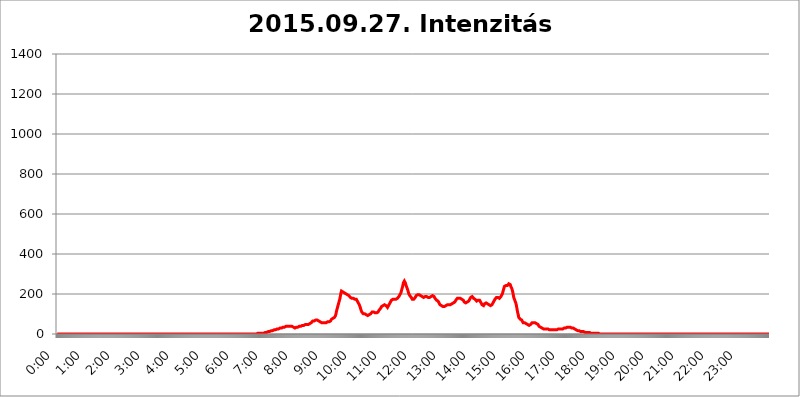
| Category | 2015.09.27. Intenzitás [W/m^2] |
|---|---|
| 0.0 | 0 |
| 0.0006944444444444445 | 0 |
| 0.001388888888888889 | 0 |
| 0.0020833333333333333 | 0 |
| 0.002777777777777778 | 0 |
| 0.003472222222222222 | 0 |
| 0.004166666666666667 | 0 |
| 0.004861111111111111 | 0 |
| 0.005555555555555556 | 0 |
| 0.0062499999999999995 | 0 |
| 0.006944444444444444 | 0 |
| 0.007638888888888889 | 0 |
| 0.008333333333333333 | 0 |
| 0.009027777777777779 | 0 |
| 0.009722222222222222 | 0 |
| 0.010416666666666666 | 0 |
| 0.011111111111111112 | 0 |
| 0.011805555555555555 | 0 |
| 0.012499999999999999 | 0 |
| 0.013194444444444444 | 0 |
| 0.013888888888888888 | 0 |
| 0.014583333333333332 | 0 |
| 0.015277777777777777 | 0 |
| 0.015972222222222224 | 0 |
| 0.016666666666666666 | 0 |
| 0.017361111111111112 | 0 |
| 0.018055555555555557 | 0 |
| 0.01875 | 0 |
| 0.019444444444444445 | 0 |
| 0.02013888888888889 | 0 |
| 0.020833333333333332 | 0 |
| 0.02152777777777778 | 0 |
| 0.022222222222222223 | 0 |
| 0.02291666666666667 | 0 |
| 0.02361111111111111 | 0 |
| 0.024305555555555556 | 0 |
| 0.024999999999999998 | 0 |
| 0.025694444444444447 | 0 |
| 0.02638888888888889 | 0 |
| 0.027083333333333334 | 0 |
| 0.027777777777777776 | 0 |
| 0.02847222222222222 | 0 |
| 0.029166666666666664 | 0 |
| 0.029861111111111113 | 0 |
| 0.030555555555555555 | 0 |
| 0.03125 | 0 |
| 0.03194444444444445 | 0 |
| 0.03263888888888889 | 0 |
| 0.03333333333333333 | 0 |
| 0.034027777777777775 | 0 |
| 0.034722222222222224 | 0 |
| 0.035416666666666666 | 0 |
| 0.036111111111111115 | 0 |
| 0.03680555555555556 | 0 |
| 0.0375 | 0 |
| 0.03819444444444444 | 0 |
| 0.03888888888888889 | 0 |
| 0.03958333333333333 | 0 |
| 0.04027777777777778 | 0 |
| 0.04097222222222222 | 0 |
| 0.041666666666666664 | 0 |
| 0.042361111111111106 | 0 |
| 0.04305555555555556 | 0 |
| 0.043750000000000004 | 0 |
| 0.044444444444444446 | 0 |
| 0.04513888888888889 | 0 |
| 0.04583333333333334 | 0 |
| 0.04652777777777778 | 0 |
| 0.04722222222222222 | 0 |
| 0.04791666666666666 | 0 |
| 0.04861111111111111 | 0 |
| 0.049305555555555554 | 0 |
| 0.049999999999999996 | 0 |
| 0.05069444444444445 | 0 |
| 0.051388888888888894 | 0 |
| 0.052083333333333336 | 0 |
| 0.05277777777777778 | 0 |
| 0.05347222222222222 | 0 |
| 0.05416666666666667 | 0 |
| 0.05486111111111111 | 0 |
| 0.05555555555555555 | 0 |
| 0.05625 | 0 |
| 0.05694444444444444 | 0 |
| 0.057638888888888885 | 0 |
| 0.05833333333333333 | 0 |
| 0.05902777777777778 | 0 |
| 0.059722222222222225 | 0 |
| 0.06041666666666667 | 0 |
| 0.061111111111111116 | 0 |
| 0.06180555555555556 | 0 |
| 0.0625 | 0 |
| 0.06319444444444444 | 0 |
| 0.06388888888888888 | 0 |
| 0.06458333333333334 | 0 |
| 0.06527777777777778 | 0 |
| 0.06597222222222222 | 0 |
| 0.06666666666666667 | 0 |
| 0.06736111111111111 | 0 |
| 0.06805555555555555 | 0 |
| 0.06874999999999999 | 0 |
| 0.06944444444444443 | 0 |
| 0.07013888888888889 | 0 |
| 0.07083333333333333 | 0 |
| 0.07152777777777779 | 0 |
| 0.07222222222222223 | 0 |
| 0.07291666666666667 | 0 |
| 0.07361111111111111 | 0 |
| 0.07430555555555556 | 0 |
| 0.075 | 0 |
| 0.07569444444444444 | 0 |
| 0.0763888888888889 | 0 |
| 0.07708333333333334 | 0 |
| 0.07777777777777778 | 0 |
| 0.07847222222222222 | 0 |
| 0.07916666666666666 | 0 |
| 0.0798611111111111 | 0 |
| 0.08055555555555556 | 0 |
| 0.08125 | 0 |
| 0.08194444444444444 | 0 |
| 0.08263888888888889 | 0 |
| 0.08333333333333333 | 0 |
| 0.08402777777777777 | 0 |
| 0.08472222222222221 | 0 |
| 0.08541666666666665 | 0 |
| 0.08611111111111112 | 0 |
| 0.08680555555555557 | 0 |
| 0.08750000000000001 | 0 |
| 0.08819444444444445 | 0 |
| 0.08888888888888889 | 0 |
| 0.08958333333333333 | 0 |
| 0.09027777777777778 | 0 |
| 0.09097222222222222 | 0 |
| 0.09166666666666667 | 0 |
| 0.09236111111111112 | 0 |
| 0.09305555555555556 | 0 |
| 0.09375 | 0 |
| 0.09444444444444444 | 0 |
| 0.09513888888888888 | 0 |
| 0.09583333333333333 | 0 |
| 0.09652777777777777 | 0 |
| 0.09722222222222222 | 0 |
| 0.09791666666666667 | 0 |
| 0.09861111111111111 | 0 |
| 0.09930555555555555 | 0 |
| 0.09999999999999999 | 0 |
| 0.10069444444444443 | 0 |
| 0.1013888888888889 | 0 |
| 0.10208333333333335 | 0 |
| 0.10277777777777779 | 0 |
| 0.10347222222222223 | 0 |
| 0.10416666666666667 | 0 |
| 0.10486111111111111 | 0 |
| 0.10555555555555556 | 0 |
| 0.10625 | 0 |
| 0.10694444444444444 | 0 |
| 0.1076388888888889 | 0 |
| 0.10833333333333334 | 0 |
| 0.10902777777777778 | 0 |
| 0.10972222222222222 | 0 |
| 0.1111111111111111 | 0 |
| 0.11180555555555556 | 0 |
| 0.11180555555555556 | 0 |
| 0.1125 | 0 |
| 0.11319444444444444 | 0 |
| 0.11388888888888889 | 0 |
| 0.11458333333333333 | 0 |
| 0.11527777777777777 | 0 |
| 0.11597222222222221 | 0 |
| 0.11666666666666665 | 0 |
| 0.1173611111111111 | 0 |
| 0.11805555555555557 | 0 |
| 0.11944444444444445 | 0 |
| 0.12013888888888889 | 0 |
| 0.12083333333333333 | 0 |
| 0.12152777777777778 | 0 |
| 0.12222222222222223 | 0 |
| 0.12291666666666667 | 0 |
| 0.12291666666666667 | 0 |
| 0.12361111111111112 | 0 |
| 0.12430555555555556 | 0 |
| 0.125 | 0 |
| 0.12569444444444444 | 0 |
| 0.12638888888888888 | 0 |
| 0.12708333333333333 | 0 |
| 0.16875 | 0 |
| 0.12847222222222224 | 0 |
| 0.12916666666666668 | 0 |
| 0.12986111111111112 | 0 |
| 0.13055555555555556 | 0 |
| 0.13125 | 0 |
| 0.13194444444444445 | 0 |
| 0.1326388888888889 | 0 |
| 0.13333333333333333 | 0 |
| 0.13402777777777777 | 0 |
| 0.13402777777777777 | 0 |
| 0.13472222222222222 | 0 |
| 0.13541666666666666 | 0 |
| 0.1361111111111111 | 0 |
| 0.13749999999999998 | 0 |
| 0.13819444444444443 | 0 |
| 0.1388888888888889 | 0 |
| 0.13958333333333334 | 0 |
| 0.14027777777777778 | 0 |
| 0.14097222222222222 | 0 |
| 0.14166666666666666 | 0 |
| 0.1423611111111111 | 0 |
| 0.14305555555555557 | 0 |
| 0.14375000000000002 | 0 |
| 0.14444444444444446 | 0 |
| 0.1451388888888889 | 0 |
| 0.1451388888888889 | 0 |
| 0.14652777777777778 | 0 |
| 0.14722222222222223 | 0 |
| 0.14791666666666667 | 0 |
| 0.1486111111111111 | 0 |
| 0.14930555555555555 | 0 |
| 0.15 | 0 |
| 0.15069444444444444 | 0 |
| 0.15138888888888888 | 0 |
| 0.15208333333333332 | 0 |
| 0.15277777777777776 | 0 |
| 0.15347222222222223 | 0 |
| 0.15416666666666667 | 0 |
| 0.15486111111111112 | 0 |
| 0.15555555555555556 | 0 |
| 0.15625 | 0 |
| 0.15694444444444444 | 0 |
| 0.15763888888888888 | 0 |
| 0.15833333333333333 | 0 |
| 0.15902777777777777 | 0 |
| 0.15972222222222224 | 0 |
| 0.16041666666666668 | 0 |
| 0.16111111111111112 | 0 |
| 0.16180555555555556 | 0 |
| 0.1625 | 0 |
| 0.16319444444444445 | 0 |
| 0.1638888888888889 | 0 |
| 0.16458333333333333 | 0 |
| 0.16527777777777777 | 0 |
| 0.16597222222222222 | 0 |
| 0.16666666666666666 | 0 |
| 0.1673611111111111 | 0 |
| 0.16805555555555554 | 0 |
| 0.16874999999999998 | 0 |
| 0.16944444444444443 | 0 |
| 0.17013888888888887 | 0 |
| 0.1708333333333333 | 0 |
| 0.17152777777777775 | 0 |
| 0.17222222222222225 | 0 |
| 0.1729166666666667 | 0 |
| 0.17361111111111113 | 0 |
| 0.17430555555555557 | 0 |
| 0.17500000000000002 | 0 |
| 0.17569444444444446 | 0 |
| 0.1763888888888889 | 0 |
| 0.17708333333333334 | 0 |
| 0.17777777777777778 | 0 |
| 0.17847222222222223 | 0 |
| 0.17916666666666667 | 0 |
| 0.1798611111111111 | 0 |
| 0.18055555555555555 | 0 |
| 0.18125 | 0 |
| 0.18194444444444444 | 0 |
| 0.1826388888888889 | 0 |
| 0.18333333333333335 | 0 |
| 0.1840277777777778 | 0 |
| 0.18472222222222223 | 0 |
| 0.18541666666666667 | 0 |
| 0.18611111111111112 | 0 |
| 0.18680555555555556 | 0 |
| 0.1875 | 0 |
| 0.18819444444444444 | 0 |
| 0.18888888888888888 | 0 |
| 0.18958333333333333 | 0 |
| 0.19027777777777777 | 0 |
| 0.1909722222222222 | 0 |
| 0.19166666666666665 | 0 |
| 0.19236111111111112 | 0 |
| 0.19305555555555554 | 0 |
| 0.19375 | 0 |
| 0.19444444444444445 | 0 |
| 0.1951388888888889 | 0 |
| 0.19583333333333333 | 0 |
| 0.19652777777777777 | 0 |
| 0.19722222222222222 | 0 |
| 0.19791666666666666 | 0 |
| 0.1986111111111111 | 0 |
| 0.19930555555555554 | 0 |
| 0.19999999999999998 | 0 |
| 0.20069444444444443 | 0 |
| 0.20138888888888887 | 0 |
| 0.2020833333333333 | 0 |
| 0.2027777777777778 | 0 |
| 0.2034722222222222 | 0 |
| 0.2041666666666667 | 0 |
| 0.20486111111111113 | 0 |
| 0.20555555555555557 | 0 |
| 0.20625000000000002 | 0 |
| 0.20694444444444446 | 0 |
| 0.2076388888888889 | 0 |
| 0.20833333333333334 | 0 |
| 0.20902777777777778 | 0 |
| 0.20972222222222223 | 0 |
| 0.21041666666666667 | 0 |
| 0.2111111111111111 | 0 |
| 0.21180555555555555 | 0 |
| 0.2125 | 0 |
| 0.21319444444444444 | 0 |
| 0.2138888888888889 | 0 |
| 0.21458333333333335 | 0 |
| 0.2152777777777778 | 0 |
| 0.21597222222222223 | 0 |
| 0.21666666666666667 | 0 |
| 0.21736111111111112 | 0 |
| 0.21805555555555556 | 0 |
| 0.21875 | 0 |
| 0.21944444444444444 | 0 |
| 0.22013888888888888 | 0 |
| 0.22083333333333333 | 0 |
| 0.22152777777777777 | 0 |
| 0.2222222222222222 | 0 |
| 0.22291666666666665 | 0 |
| 0.2236111111111111 | 0 |
| 0.22430555555555556 | 0 |
| 0.225 | 0 |
| 0.22569444444444445 | 0 |
| 0.2263888888888889 | 0 |
| 0.22708333333333333 | 0 |
| 0.22777777777777777 | 0 |
| 0.22847222222222222 | 0 |
| 0.22916666666666666 | 0 |
| 0.2298611111111111 | 0 |
| 0.23055555555555554 | 0 |
| 0.23124999999999998 | 0 |
| 0.23194444444444443 | 0 |
| 0.23263888888888887 | 0 |
| 0.2333333333333333 | 0 |
| 0.2340277777777778 | 0 |
| 0.2347222222222222 | 0 |
| 0.2354166666666667 | 0 |
| 0.23611111111111113 | 0 |
| 0.23680555555555557 | 0 |
| 0.23750000000000002 | 0 |
| 0.23819444444444446 | 0 |
| 0.2388888888888889 | 0 |
| 0.23958333333333334 | 0 |
| 0.24027777777777778 | 0 |
| 0.24097222222222223 | 0 |
| 0.24166666666666667 | 0 |
| 0.2423611111111111 | 0 |
| 0.24305555555555555 | 0 |
| 0.24375 | 0 |
| 0.24444444444444446 | 0 |
| 0.24513888888888888 | 0 |
| 0.24583333333333335 | 0 |
| 0.2465277777777778 | 0 |
| 0.24722222222222223 | 0 |
| 0.24791666666666667 | 0 |
| 0.24861111111111112 | 0 |
| 0.24930555555555556 | 0 |
| 0.25 | 0 |
| 0.25069444444444444 | 0 |
| 0.2513888888888889 | 0 |
| 0.2520833333333333 | 0 |
| 0.25277777777777777 | 0 |
| 0.2534722222222222 | 0 |
| 0.25416666666666665 | 0 |
| 0.2548611111111111 | 0 |
| 0.2555555555555556 | 0 |
| 0.25625000000000003 | 0 |
| 0.2569444444444445 | 0 |
| 0.2576388888888889 | 0 |
| 0.25833333333333336 | 0 |
| 0.2590277777777778 | 0 |
| 0.25972222222222224 | 0 |
| 0.2604166666666667 | 0 |
| 0.2611111111111111 | 0 |
| 0.26180555555555557 | 0 |
| 0.2625 | 0 |
| 0.26319444444444445 | 0 |
| 0.2638888888888889 | 0 |
| 0.26458333333333334 | 0 |
| 0.2652777777777778 | 0 |
| 0.2659722222222222 | 0 |
| 0.26666666666666666 | 0 |
| 0.2673611111111111 | 0 |
| 0.26805555555555555 | 0 |
| 0.26875 | 0 |
| 0.26944444444444443 | 0 |
| 0.2701388888888889 | 0 |
| 0.2708333333333333 | 0 |
| 0.27152777777777776 | 0 |
| 0.2722222222222222 | 0 |
| 0.27291666666666664 | 0 |
| 0.2736111111111111 | 0 |
| 0.2743055555555555 | 0 |
| 0.27499999999999997 | 0 |
| 0.27569444444444446 | 0 |
| 0.27638888888888885 | 0 |
| 0.27708333333333335 | 0 |
| 0.2777777777777778 | 0 |
| 0.27847222222222223 | 0 |
| 0.2791666666666667 | 0 |
| 0.2798611111111111 | 0 |
| 0.28055555555555556 | 0 |
| 0.28125 | 3.525 |
| 0.28194444444444444 | 3.525 |
| 0.2826388888888889 | 3.525 |
| 0.2833333333333333 | 3.525 |
| 0.28402777777777777 | 3.525 |
| 0.2847222222222222 | 3.525 |
| 0.28541666666666665 | 3.525 |
| 0.28611111111111115 | 3.525 |
| 0.28680555555555554 | 3.525 |
| 0.28750000000000003 | 3.525 |
| 0.2881944444444445 | 3.525 |
| 0.2888888888888889 | 3.525 |
| 0.28958333333333336 | 3.525 |
| 0.2902777777777778 | 7.887 |
| 0.29097222222222224 | 7.887 |
| 0.2916666666666667 | 7.887 |
| 0.2923611111111111 | 7.887 |
| 0.29305555555555557 | 7.887 |
| 0.29375 | 7.887 |
| 0.29444444444444445 | 7.887 |
| 0.2951388888888889 | 12.257 |
| 0.29583333333333334 | 12.257 |
| 0.2965277777777778 | 12.257 |
| 0.2972222222222222 | 12.257 |
| 0.29791666666666666 | 12.257 |
| 0.2986111111111111 | 12.257 |
| 0.29930555555555555 | 12.257 |
| 0.3 | 16.636 |
| 0.30069444444444443 | 16.636 |
| 0.3013888888888889 | 16.636 |
| 0.3020833333333333 | 16.636 |
| 0.30277777777777776 | 16.636 |
| 0.3034722222222222 | 16.636 |
| 0.30416666666666664 | 21.024 |
| 0.3048611111111111 | 21.024 |
| 0.3055555555555555 | 21.024 |
| 0.30624999999999997 | 21.024 |
| 0.3069444444444444 | 21.024 |
| 0.3076388888888889 | 21.024 |
| 0.30833333333333335 | 25.419 |
| 0.3090277777777778 | 25.419 |
| 0.30972222222222223 | 25.419 |
| 0.3104166666666667 | 25.419 |
| 0.3111111111111111 | 25.419 |
| 0.31180555555555556 | 25.419 |
| 0.3125 | 29.823 |
| 0.31319444444444444 | 29.823 |
| 0.3138888888888889 | 29.823 |
| 0.3145833333333333 | 29.823 |
| 0.31527777777777777 | 29.823 |
| 0.3159722222222222 | 34.234 |
| 0.31666666666666665 | 34.234 |
| 0.31736111111111115 | 34.234 |
| 0.31805555555555554 | 34.234 |
| 0.31875000000000003 | 34.234 |
| 0.3194444444444445 | 34.234 |
| 0.3201388888888889 | 38.653 |
| 0.32083333333333336 | 38.653 |
| 0.3215277777777778 | 38.653 |
| 0.32222222222222224 | 38.653 |
| 0.3229166666666667 | 38.653 |
| 0.3236111111111111 | 38.653 |
| 0.32430555555555557 | 38.653 |
| 0.325 | 38.653 |
| 0.32569444444444445 | 38.653 |
| 0.3263888888888889 | 38.653 |
| 0.32708333333333334 | 38.653 |
| 0.3277777777777778 | 38.653 |
| 0.3284722222222222 | 38.653 |
| 0.32916666666666666 | 38.653 |
| 0.3298611111111111 | 34.234 |
| 0.33055555555555555 | 34.234 |
| 0.33125 | 34.234 |
| 0.33194444444444443 | 34.234 |
| 0.3326388888888889 | 34.234 |
| 0.3333333333333333 | 29.823 |
| 0.3340277777777778 | 29.823 |
| 0.3347222222222222 | 29.823 |
| 0.3354166666666667 | 34.234 |
| 0.3361111111111111 | 34.234 |
| 0.3368055555555556 | 34.234 |
| 0.33749999999999997 | 34.234 |
| 0.33819444444444446 | 34.234 |
| 0.33888888888888885 | 38.653 |
| 0.33958333333333335 | 38.653 |
| 0.34027777777777773 | 38.653 |
| 0.34097222222222223 | 38.653 |
| 0.3416666666666666 | 38.653 |
| 0.3423611111111111 | 38.653 |
| 0.3430555555555555 | 38.653 |
| 0.34375 | 43.079 |
| 0.3444444444444445 | 43.079 |
| 0.3451388888888889 | 43.079 |
| 0.3458333333333334 | 43.079 |
| 0.34652777777777777 | 47.511 |
| 0.34722222222222227 | 47.511 |
| 0.34791666666666665 | 47.511 |
| 0.34861111111111115 | 47.511 |
| 0.34930555555555554 | 47.511 |
| 0.35000000000000003 | 47.511 |
| 0.3506944444444444 | 47.511 |
| 0.3513888888888889 | 47.511 |
| 0.3520833333333333 | 47.511 |
| 0.3527777777777778 | 47.511 |
| 0.3534722222222222 | 51.951 |
| 0.3541666666666667 | 51.951 |
| 0.3548611111111111 | 51.951 |
| 0.35555555555555557 | 56.398 |
| 0.35625 | 56.398 |
| 0.35694444444444445 | 60.85 |
| 0.3576388888888889 | 60.85 |
| 0.35833333333333334 | 65.31 |
| 0.3590277777777778 | 65.31 |
| 0.3597222222222222 | 65.31 |
| 0.36041666666666666 | 65.31 |
| 0.3611111111111111 | 69.775 |
| 0.36180555555555555 | 69.775 |
| 0.3625 | 69.775 |
| 0.36319444444444443 | 69.775 |
| 0.3638888888888889 | 69.775 |
| 0.3645833333333333 | 69.775 |
| 0.3652777777777778 | 69.775 |
| 0.3659722222222222 | 65.31 |
| 0.3666666666666667 | 65.31 |
| 0.3673611111111111 | 65.31 |
| 0.3680555555555556 | 65.31 |
| 0.36874999999999997 | 60.85 |
| 0.36944444444444446 | 56.398 |
| 0.37013888888888885 | 56.398 |
| 0.37083333333333335 | 56.398 |
| 0.37152777777777773 | 56.398 |
| 0.37222222222222223 | 51.951 |
| 0.3729166666666666 | 56.398 |
| 0.3736111111111111 | 56.398 |
| 0.3743055555555555 | 56.398 |
| 0.375 | 56.398 |
| 0.3756944444444445 | 56.398 |
| 0.3763888888888889 | 56.398 |
| 0.3770833333333334 | 56.398 |
| 0.37777777777777777 | 60.85 |
| 0.37847222222222227 | 60.85 |
| 0.37916666666666665 | 60.85 |
| 0.37986111111111115 | 60.85 |
| 0.38055555555555554 | 60.85 |
| 0.38125000000000003 | 60.85 |
| 0.3819444444444444 | 65.31 |
| 0.3826388888888889 | 65.31 |
| 0.3833333333333333 | 65.31 |
| 0.3840277777777778 | 69.775 |
| 0.3847222222222222 | 74.246 |
| 0.3854166666666667 | 74.246 |
| 0.3861111111111111 | 78.722 |
| 0.38680555555555557 | 78.722 |
| 0.3875 | 78.722 |
| 0.38819444444444445 | 83.205 |
| 0.3888888888888889 | 83.205 |
| 0.38958333333333334 | 87.692 |
| 0.3902777777777778 | 92.184 |
| 0.3909722222222222 | 101.184 |
| 0.39166666666666666 | 114.716 |
| 0.3923611111111111 | 123.758 |
| 0.39305555555555555 | 132.814 |
| 0.39375 | 141.884 |
| 0.39444444444444443 | 150.964 |
| 0.3951388888888889 | 155.509 |
| 0.3958333333333333 | 169.156 |
| 0.3965277777777778 | 178.264 |
| 0.3972222222222222 | 191.937 |
| 0.3979166666666667 | 205.62 |
| 0.3986111111111111 | 214.746 |
| 0.3993055555555556 | 219.309 |
| 0.39999999999999997 | 214.746 |
| 0.40069444444444446 | 210.182 |
| 0.40138888888888885 | 210.182 |
| 0.40208333333333335 | 205.62 |
| 0.40277777777777773 | 205.62 |
| 0.40347222222222223 | 205.62 |
| 0.4041666666666666 | 201.058 |
| 0.4048611111111111 | 201.058 |
| 0.4055555555555555 | 201.058 |
| 0.40625 | 201.058 |
| 0.4069444444444445 | 196.497 |
| 0.4076388888888889 | 196.497 |
| 0.4083333333333334 | 191.937 |
| 0.40902777777777777 | 191.937 |
| 0.40972222222222227 | 191.937 |
| 0.41041666666666665 | 187.378 |
| 0.41111111111111115 | 182.82 |
| 0.41180555555555554 | 182.82 |
| 0.41250000000000003 | 182.82 |
| 0.4131944444444444 | 178.264 |
| 0.4138888888888889 | 178.264 |
| 0.4145833333333333 | 178.264 |
| 0.4152777777777778 | 178.264 |
| 0.4159722222222222 | 178.264 |
| 0.4166666666666667 | 178.264 |
| 0.4173611111111111 | 173.709 |
| 0.41805555555555557 | 173.709 |
| 0.41875 | 173.709 |
| 0.41944444444444445 | 173.709 |
| 0.4201388888888889 | 169.156 |
| 0.42083333333333334 | 164.605 |
| 0.4215277777777778 | 164.605 |
| 0.4222222222222222 | 155.509 |
| 0.42291666666666666 | 150.964 |
| 0.4236111111111111 | 146.423 |
| 0.42430555555555555 | 141.884 |
| 0.425 | 132.814 |
| 0.42569444444444443 | 123.758 |
| 0.4263888888888889 | 119.235 |
| 0.4270833333333333 | 110.201 |
| 0.4277777777777778 | 105.69 |
| 0.4284722222222222 | 105.69 |
| 0.4291666666666667 | 101.184 |
| 0.4298611111111111 | 101.184 |
| 0.4305555555555556 | 101.184 |
| 0.43124999999999997 | 101.184 |
| 0.43194444444444446 | 96.682 |
| 0.43263888888888885 | 96.682 |
| 0.43333333333333335 | 96.682 |
| 0.43402777777777773 | 92.184 |
| 0.43472222222222223 | 92.184 |
| 0.4354166666666666 | 92.184 |
| 0.4361111111111111 | 92.184 |
| 0.4368055555555555 | 92.184 |
| 0.4375 | 96.682 |
| 0.4381944444444445 | 96.682 |
| 0.4388888888888889 | 101.184 |
| 0.4395833333333334 | 101.184 |
| 0.44027777777777777 | 105.69 |
| 0.44097222222222227 | 105.69 |
| 0.44166666666666665 | 110.201 |
| 0.44236111111111115 | 110.201 |
| 0.44305555555555554 | 110.201 |
| 0.44375000000000003 | 110.201 |
| 0.4444444444444444 | 110.201 |
| 0.4451388888888889 | 110.201 |
| 0.4458333333333333 | 105.69 |
| 0.4465277777777778 | 105.69 |
| 0.4472222222222222 | 105.69 |
| 0.4479166666666667 | 105.69 |
| 0.4486111111111111 | 105.69 |
| 0.44930555555555557 | 110.201 |
| 0.45 | 110.201 |
| 0.45069444444444445 | 114.716 |
| 0.4513888888888889 | 119.235 |
| 0.45208333333333334 | 123.758 |
| 0.4527777777777778 | 123.758 |
| 0.4534722222222222 | 128.284 |
| 0.45416666666666666 | 132.814 |
| 0.4548611111111111 | 137.347 |
| 0.45555555555555555 | 137.347 |
| 0.45625 | 141.884 |
| 0.45694444444444443 | 141.884 |
| 0.4576388888888889 | 146.423 |
| 0.4583333333333333 | 146.423 |
| 0.4590277777777778 | 146.423 |
| 0.4597222222222222 | 146.423 |
| 0.4604166666666667 | 141.884 |
| 0.4611111111111111 | 141.884 |
| 0.4618055555555556 | 137.347 |
| 0.46249999999999997 | 137.347 |
| 0.46319444444444446 | 132.814 |
| 0.46388888888888885 | 137.347 |
| 0.46458333333333335 | 141.884 |
| 0.46527777777777773 | 146.423 |
| 0.46597222222222223 | 150.964 |
| 0.4666666666666666 | 155.509 |
| 0.4673611111111111 | 160.056 |
| 0.4680555555555555 | 164.605 |
| 0.46875 | 169.156 |
| 0.4694444444444445 | 169.156 |
| 0.4701388888888889 | 169.156 |
| 0.4708333333333334 | 173.709 |
| 0.47152777777777777 | 173.709 |
| 0.47222222222222227 | 173.709 |
| 0.47291666666666665 | 173.709 |
| 0.47361111111111115 | 173.709 |
| 0.47430555555555554 | 173.709 |
| 0.47500000000000003 | 173.709 |
| 0.4756944444444444 | 173.709 |
| 0.4763888888888889 | 178.264 |
| 0.4770833333333333 | 178.264 |
| 0.4777777777777778 | 182.82 |
| 0.4784722222222222 | 182.82 |
| 0.4791666666666667 | 187.378 |
| 0.4798611111111111 | 191.937 |
| 0.48055555555555557 | 196.497 |
| 0.48125 | 201.058 |
| 0.48194444444444445 | 205.62 |
| 0.4826388888888889 | 214.746 |
| 0.48333333333333334 | 223.873 |
| 0.4840277777777778 | 233 |
| 0.4847222222222222 | 242.127 |
| 0.48541666666666666 | 255.813 |
| 0.4861111111111111 | 260.373 |
| 0.48680555555555555 | 264.932 |
| 0.4875 | 260.373 |
| 0.48819444444444443 | 255.813 |
| 0.4888888888888889 | 246.689 |
| 0.4895833333333333 | 242.127 |
| 0.4902777777777778 | 233 |
| 0.4909722222222222 | 228.436 |
| 0.4916666666666667 | 219.309 |
| 0.4923611111111111 | 210.182 |
| 0.4930555555555556 | 201.058 |
| 0.49374999999999997 | 196.497 |
| 0.49444444444444446 | 191.937 |
| 0.49513888888888885 | 191.937 |
| 0.49583333333333335 | 187.378 |
| 0.49652777777777773 | 182.82 |
| 0.49722222222222223 | 178.264 |
| 0.4979166666666666 | 173.709 |
| 0.4986111111111111 | 173.709 |
| 0.4993055555555555 | 173.709 |
| 0.5 | 173.709 |
| 0.5006944444444444 | 178.264 |
| 0.5013888888888889 | 178.264 |
| 0.5020833333333333 | 182.82 |
| 0.5027777777777778 | 187.378 |
| 0.5034722222222222 | 191.937 |
| 0.5041666666666667 | 191.937 |
| 0.5048611111111111 | 196.497 |
| 0.5055555555555555 | 196.497 |
| 0.50625 | 196.497 |
| 0.5069444444444444 | 196.497 |
| 0.5076388888888889 | 196.497 |
| 0.5083333333333333 | 191.937 |
| 0.5090277777777777 | 191.937 |
| 0.5097222222222222 | 191.937 |
| 0.5104166666666666 | 191.937 |
| 0.5111111111111112 | 187.378 |
| 0.5118055555555555 | 187.378 |
| 0.5125000000000001 | 187.378 |
| 0.5131944444444444 | 187.378 |
| 0.513888888888889 | 182.82 |
| 0.5145833333333333 | 182.82 |
| 0.5152777777777778 | 187.378 |
| 0.5159722222222222 | 187.378 |
| 0.5166666666666667 | 182.82 |
| 0.517361111111111 | 187.378 |
| 0.5180555555555556 | 187.378 |
| 0.5187499999999999 | 187.378 |
| 0.5194444444444445 | 187.378 |
| 0.5201388888888888 | 182.82 |
| 0.5208333333333334 | 182.82 |
| 0.5215277777777778 | 182.82 |
| 0.5222222222222223 | 182.82 |
| 0.5229166666666667 | 182.82 |
| 0.5236111111111111 | 187.378 |
| 0.5243055555555556 | 187.378 |
| 0.525 | 187.378 |
| 0.5256944444444445 | 187.378 |
| 0.5263888888888889 | 191.937 |
| 0.5270833333333333 | 191.937 |
| 0.5277777777777778 | 187.378 |
| 0.5284722222222222 | 187.378 |
| 0.5291666666666667 | 182.82 |
| 0.5298611111111111 | 178.264 |
| 0.5305555555555556 | 173.709 |
| 0.53125 | 173.709 |
| 0.5319444444444444 | 169.156 |
| 0.5326388888888889 | 164.605 |
| 0.5333333333333333 | 164.605 |
| 0.5340277777777778 | 164.605 |
| 0.5347222222222222 | 160.056 |
| 0.5354166666666667 | 155.509 |
| 0.5361111111111111 | 155.509 |
| 0.5368055555555555 | 146.423 |
| 0.5375 | 146.423 |
| 0.5381944444444444 | 141.884 |
| 0.5388888888888889 | 141.884 |
| 0.5395833333333333 | 137.347 |
| 0.5402777777777777 | 137.347 |
| 0.5409722222222222 | 137.347 |
| 0.5416666666666666 | 137.347 |
| 0.5423611111111112 | 137.347 |
| 0.5430555555555555 | 137.347 |
| 0.5437500000000001 | 141.884 |
| 0.5444444444444444 | 141.884 |
| 0.545138888888889 | 141.884 |
| 0.5458333333333333 | 146.423 |
| 0.5465277777777778 | 146.423 |
| 0.5472222222222222 | 146.423 |
| 0.5479166666666667 | 146.423 |
| 0.548611111111111 | 146.423 |
| 0.5493055555555556 | 146.423 |
| 0.5499999999999999 | 146.423 |
| 0.5506944444444445 | 146.423 |
| 0.5513888888888888 | 146.423 |
| 0.5520833333333334 | 150.964 |
| 0.5527777777777778 | 150.964 |
| 0.5534722222222223 | 150.964 |
| 0.5541666666666667 | 150.964 |
| 0.5548611111111111 | 155.509 |
| 0.5555555555555556 | 155.509 |
| 0.55625 | 155.509 |
| 0.5569444444444445 | 160.056 |
| 0.5576388888888889 | 160.056 |
| 0.5583333333333333 | 164.605 |
| 0.5590277777777778 | 169.156 |
| 0.5597222222222222 | 173.709 |
| 0.5604166666666667 | 173.709 |
| 0.5611111111111111 | 178.264 |
| 0.5618055555555556 | 182.82 |
| 0.5625 | 182.82 |
| 0.5631944444444444 | 178.264 |
| 0.5638888888888889 | 178.264 |
| 0.5645833333333333 | 173.709 |
| 0.5652777777777778 | 178.264 |
| 0.5659722222222222 | 173.709 |
| 0.5666666666666667 | 173.709 |
| 0.5673611111111111 | 173.709 |
| 0.5680555555555555 | 173.709 |
| 0.56875 | 173.709 |
| 0.5694444444444444 | 169.156 |
| 0.5701388888888889 | 164.605 |
| 0.5708333333333333 | 160.056 |
| 0.5715277777777777 | 160.056 |
| 0.5722222222222222 | 155.509 |
| 0.5729166666666666 | 155.509 |
| 0.5736111111111112 | 160.056 |
| 0.5743055555555555 | 160.056 |
| 0.5750000000000001 | 160.056 |
| 0.5756944444444444 | 164.605 |
| 0.576388888888889 | 164.605 |
| 0.5770833333333333 | 164.605 |
| 0.5777777777777778 | 169.156 |
| 0.5784722222222222 | 173.709 |
| 0.5791666666666667 | 178.264 |
| 0.579861111111111 | 182.82 |
| 0.5805555555555556 | 182.82 |
| 0.5812499999999999 | 187.378 |
| 0.5819444444444445 | 187.378 |
| 0.5826388888888888 | 182.82 |
| 0.5833333333333334 | 182.82 |
| 0.5840277777777778 | 178.264 |
| 0.5847222222222223 | 178.264 |
| 0.5854166666666667 | 173.709 |
| 0.5861111111111111 | 173.709 |
| 0.5868055555555556 | 169.156 |
| 0.5875 | 169.156 |
| 0.5881944444444445 | 164.605 |
| 0.5888888888888889 | 164.605 |
| 0.5895833333333333 | 164.605 |
| 0.5902777777777778 | 169.156 |
| 0.5909722222222222 | 169.156 |
| 0.5916666666666667 | 169.156 |
| 0.5923611111111111 | 169.156 |
| 0.5930555555555556 | 164.605 |
| 0.59375 | 164.605 |
| 0.5944444444444444 | 155.509 |
| 0.5951388888888889 | 150.964 |
| 0.5958333333333333 | 146.423 |
| 0.5965277777777778 | 141.884 |
| 0.5972222222222222 | 141.884 |
| 0.5979166666666667 | 141.884 |
| 0.5986111111111111 | 146.423 |
| 0.5993055555555555 | 150.964 |
| 0.6 | 155.509 |
| 0.6006944444444444 | 155.509 |
| 0.6013888888888889 | 155.509 |
| 0.6020833333333333 | 155.509 |
| 0.6027777777777777 | 155.509 |
| 0.6034722222222222 | 150.964 |
| 0.6041666666666666 | 150.964 |
| 0.6048611111111112 | 146.423 |
| 0.6055555555555555 | 146.423 |
| 0.6062500000000001 | 146.423 |
| 0.6069444444444444 | 141.884 |
| 0.607638888888889 | 141.884 |
| 0.6083333333333333 | 141.884 |
| 0.6090277777777778 | 141.884 |
| 0.6097222222222222 | 146.423 |
| 0.6104166666666667 | 146.423 |
| 0.611111111111111 | 155.509 |
| 0.6118055555555556 | 155.509 |
| 0.6124999999999999 | 164.605 |
| 0.6131944444444445 | 169.156 |
| 0.6138888888888888 | 173.709 |
| 0.6145833333333334 | 173.709 |
| 0.6152777777777778 | 178.264 |
| 0.6159722222222223 | 182.82 |
| 0.6166666666666667 | 182.82 |
| 0.6173611111111111 | 182.82 |
| 0.6180555555555556 | 182.82 |
| 0.61875 | 178.264 |
| 0.6194444444444445 | 178.264 |
| 0.6201388888888889 | 178.264 |
| 0.6208333333333333 | 182.82 |
| 0.6215277777777778 | 182.82 |
| 0.6222222222222222 | 187.378 |
| 0.6229166666666667 | 191.937 |
| 0.6236111111111111 | 191.937 |
| 0.6243055555555556 | 201.058 |
| 0.625 | 210.182 |
| 0.6256944444444444 | 219.309 |
| 0.6263888888888889 | 228.436 |
| 0.6270833333333333 | 237.564 |
| 0.6277777777777778 | 242.127 |
| 0.6284722222222222 | 242.127 |
| 0.6291666666666667 | 242.127 |
| 0.6298611111111111 | 242.127 |
| 0.6305555555555555 | 242.127 |
| 0.63125 | 242.127 |
| 0.6319444444444444 | 242.127 |
| 0.6326388888888889 | 242.127 |
| 0.6333333333333333 | 251.251 |
| 0.6340277777777777 | 251.251 |
| 0.6347222222222222 | 251.251 |
| 0.6354166666666666 | 246.689 |
| 0.6361111111111112 | 237.564 |
| 0.6368055555555555 | 233 |
| 0.6375000000000001 | 228.436 |
| 0.6381944444444444 | 219.309 |
| 0.638888888888889 | 210.182 |
| 0.6395833333333333 | 196.497 |
| 0.6402777777777778 | 182.82 |
| 0.6409722222222222 | 178.264 |
| 0.6416666666666667 | 169.156 |
| 0.642361111111111 | 164.605 |
| 0.6430555555555556 | 155.509 |
| 0.6437499999999999 | 146.423 |
| 0.6444444444444445 | 132.814 |
| 0.6451388888888888 | 119.235 |
| 0.6458333333333334 | 105.69 |
| 0.6465277777777778 | 96.682 |
| 0.6472222222222223 | 83.205 |
| 0.6479166666666667 | 78.722 |
| 0.6486111111111111 | 78.722 |
| 0.6493055555555556 | 74.246 |
| 0.65 | 74.246 |
| 0.6506944444444445 | 69.775 |
| 0.6513888888888889 | 69.775 |
| 0.6520833333333333 | 65.31 |
| 0.6527777777777778 | 65.31 |
| 0.6534722222222222 | 56.398 |
| 0.6541666666666667 | 56.398 |
| 0.6548611111111111 | 56.398 |
| 0.6555555555555556 | 56.398 |
| 0.65625 | 56.398 |
| 0.6569444444444444 | 51.951 |
| 0.6576388888888889 | 51.951 |
| 0.6583333333333333 | 47.511 |
| 0.6590277777777778 | 47.511 |
| 0.6597222222222222 | 47.511 |
| 0.6604166666666667 | 43.079 |
| 0.6611111111111111 | 43.079 |
| 0.6618055555555555 | 43.079 |
| 0.6625 | 43.079 |
| 0.6631944444444444 | 47.511 |
| 0.6638888888888889 | 47.511 |
| 0.6645833333333333 | 47.511 |
| 0.6652777777777777 | 51.951 |
| 0.6659722222222222 | 56.398 |
| 0.6666666666666666 | 56.398 |
| 0.6673611111111111 | 56.398 |
| 0.6680555555555556 | 56.398 |
| 0.6687500000000001 | 56.398 |
| 0.6694444444444444 | 56.398 |
| 0.6701388888888888 | 56.398 |
| 0.6708333333333334 | 51.951 |
| 0.6715277777777778 | 51.951 |
| 0.6722222222222222 | 51.951 |
| 0.6729166666666666 | 47.511 |
| 0.6736111111111112 | 47.511 |
| 0.6743055555555556 | 47.511 |
| 0.6749999999999999 | 43.079 |
| 0.6756944444444444 | 38.653 |
| 0.6763888888888889 | 38.653 |
| 0.6770833333333334 | 34.234 |
| 0.6777777777777777 | 34.234 |
| 0.6784722222222223 | 29.823 |
| 0.6791666666666667 | 29.823 |
| 0.6798611111111111 | 29.823 |
| 0.6805555555555555 | 29.823 |
| 0.68125 | 29.823 |
| 0.6819444444444445 | 25.419 |
| 0.6826388888888889 | 25.419 |
| 0.6833333333333332 | 25.419 |
| 0.6840277777777778 | 25.419 |
| 0.6847222222222222 | 25.419 |
| 0.6854166666666667 | 25.419 |
| 0.686111111111111 | 25.419 |
| 0.6868055555555556 | 25.419 |
| 0.6875 | 25.419 |
| 0.6881944444444444 | 25.419 |
| 0.688888888888889 | 21.024 |
| 0.6895833333333333 | 21.024 |
| 0.6902777777777778 | 21.024 |
| 0.6909722222222222 | 21.024 |
| 0.6916666666666668 | 21.024 |
| 0.6923611111111111 | 21.024 |
| 0.6930555555555555 | 21.024 |
| 0.69375 | 21.024 |
| 0.6944444444444445 | 21.024 |
| 0.6951388888888889 | 21.024 |
| 0.6958333333333333 | 21.024 |
| 0.6965277777777777 | 21.024 |
| 0.6972222222222223 | 21.024 |
| 0.6979166666666666 | 21.024 |
| 0.6986111111111111 | 21.024 |
| 0.6993055555555556 | 21.024 |
| 0.7000000000000001 | 21.024 |
| 0.7006944444444444 | 21.024 |
| 0.7013888888888888 | 25.419 |
| 0.7020833333333334 | 25.419 |
| 0.7027777777777778 | 25.419 |
| 0.7034722222222222 | 25.419 |
| 0.7041666666666666 | 25.419 |
| 0.7048611111111112 | 25.419 |
| 0.7055555555555556 | 25.419 |
| 0.7062499999999999 | 25.419 |
| 0.7069444444444444 | 25.419 |
| 0.7076388888888889 | 25.419 |
| 0.7083333333333334 | 25.419 |
| 0.7090277777777777 | 25.419 |
| 0.7097222222222223 | 29.823 |
| 0.7104166666666667 | 29.823 |
| 0.7111111111111111 | 29.823 |
| 0.7118055555555555 | 29.823 |
| 0.7125 | 29.823 |
| 0.7131944444444445 | 29.823 |
| 0.7138888888888889 | 29.823 |
| 0.7145833333333332 | 29.823 |
| 0.7152777777777778 | 34.234 |
| 0.7159722222222222 | 34.234 |
| 0.7166666666666667 | 34.234 |
| 0.717361111111111 | 34.234 |
| 0.7180555555555556 | 38.653 |
| 0.71875 | 34.234 |
| 0.7194444444444444 | 34.234 |
| 0.720138888888889 | 29.823 |
| 0.7208333333333333 | 29.823 |
| 0.7215277777777778 | 29.823 |
| 0.7222222222222222 | 29.823 |
| 0.7229166666666668 | 29.823 |
| 0.7236111111111111 | 29.823 |
| 0.7243055555555555 | 29.823 |
| 0.725 | 29.823 |
| 0.7256944444444445 | 25.419 |
| 0.7263888888888889 | 25.419 |
| 0.7270833333333333 | 21.024 |
| 0.7277777777777777 | 21.024 |
| 0.7284722222222223 | 21.024 |
| 0.7291666666666666 | 16.636 |
| 0.7298611111111111 | 16.636 |
| 0.7305555555555556 | 16.636 |
| 0.7312500000000001 | 16.636 |
| 0.7319444444444444 | 16.636 |
| 0.7326388888888888 | 16.636 |
| 0.7333333333333334 | 16.636 |
| 0.7340277777777778 | 12.257 |
| 0.7347222222222222 | 12.257 |
| 0.7354166666666666 | 12.257 |
| 0.7361111111111112 | 12.257 |
| 0.7368055555555556 | 12.257 |
| 0.7374999999999999 | 12.257 |
| 0.7381944444444444 | 12.257 |
| 0.7388888888888889 | 7.887 |
| 0.7395833333333334 | 7.887 |
| 0.7402777777777777 | 7.887 |
| 0.7409722222222223 | 7.887 |
| 0.7416666666666667 | 7.887 |
| 0.7423611111111111 | 7.887 |
| 0.7430555555555555 | 7.887 |
| 0.74375 | 7.887 |
| 0.7444444444444445 | 7.887 |
| 0.7451388888888889 | 7.887 |
| 0.7458333333333332 | 7.887 |
| 0.7465277777777778 | 7.887 |
| 0.7472222222222222 | 3.525 |
| 0.7479166666666667 | 3.525 |
| 0.748611111111111 | 3.525 |
| 0.7493055555555556 | 3.525 |
| 0.75 | 3.525 |
| 0.7506944444444444 | 3.525 |
| 0.751388888888889 | 3.525 |
| 0.7520833333333333 | 3.525 |
| 0.7527777777777778 | 3.525 |
| 0.7534722222222222 | 3.525 |
| 0.7541666666666668 | 3.525 |
| 0.7548611111111111 | 3.525 |
| 0.7555555555555555 | 3.525 |
| 0.75625 | 3.525 |
| 0.7569444444444445 | 3.525 |
| 0.7576388888888889 | 3.525 |
| 0.7583333333333333 | 0 |
| 0.7590277777777777 | 3.525 |
| 0.7597222222222223 | 0 |
| 0.7604166666666666 | 0 |
| 0.7611111111111111 | 0 |
| 0.7618055555555556 | 0 |
| 0.7625000000000001 | 0 |
| 0.7631944444444444 | 0 |
| 0.7638888888888888 | 0 |
| 0.7645833333333334 | 0 |
| 0.7652777777777778 | 0 |
| 0.7659722222222222 | 0 |
| 0.7666666666666666 | 0 |
| 0.7673611111111112 | 0 |
| 0.7680555555555556 | 0 |
| 0.7687499999999999 | 0 |
| 0.7694444444444444 | 0 |
| 0.7701388888888889 | 0 |
| 0.7708333333333334 | 0 |
| 0.7715277777777777 | 0 |
| 0.7722222222222223 | 0 |
| 0.7729166666666667 | 0 |
| 0.7736111111111111 | 0 |
| 0.7743055555555555 | 0 |
| 0.775 | 0 |
| 0.7756944444444445 | 0 |
| 0.7763888888888889 | 0 |
| 0.7770833333333332 | 0 |
| 0.7777777777777778 | 0 |
| 0.7784722222222222 | 0 |
| 0.7791666666666667 | 0 |
| 0.779861111111111 | 0 |
| 0.7805555555555556 | 0 |
| 0.78125 | 0 |
| 0.7819444444444444 | 0 |
| 0.782638888888889 | 0 |
| 0.7833333333333333 | 0 |
| 0.7840277777777778 | 0 |
| 0.7847222222222222 | 0 |
| 0.7854166666666668 | 0 |
| 0.7861111111111111 | 0 |
| 0.7868055555555555 | 0 |
| 0.7875 | 0 |
| 0.7881944444444445 | 0 |
| 0.7888888888888889 | 0 |
| 0.7895833333333333 | 0 |
| 0.7902777777777777 | 0 |
| 0.7909722222222223 | 0 |
| 0.7916666666666666 | 0 |
| 0.7923611111111111 | 0 |
| 0.7930555555555556 | 0 |
| 0.7937500000000001 | 0 |
| 0.7944444444444444 | 0 |
| 0.7951388888888888 | 0 |
| 0.7958333333333334 | 0 |
| 0.7965277777777778 | 0 |
| 0.7972222222222222 | 0 |
| 0.7979166666666666 | 0 |
| 0.7986111111111112 | 0 |
| 0.7993055555555556 | 0 |
| 0.7999999999999999 | 0 |
| 0.8006944444444444 | 0 |
| 0.8013888888888889 | 0 |
| 0.8020833333333334 | 0 |
| 0.8027777777777777 | 0 |
| 0.8034722222222223 | 0 |
| 0.8041666666666667 | 0 |
| 0.8048611111111111 | 0 |
| 0.8055555555555555 | 0 |
| 0.80625 | 0 |
| 0.8069444444444445 | 0 |
| 0.8076388888888889 | 0 |
| 0.8083333333333332 | 0 |
| 0.8090277777777778 | 0 |
| 0.8097222222222222 | 0 |
| 0.8104166666666667 | 0 |
| 0.811111111111111 | 0 |
| 0.8118055555555556 | 0 |
| 0.8125 | 0 |
| 0.8131944444444444 | 0 |
| 0.813888888888889 | 0 |
| 0.8145833333333333 | 0 |
| 0.8152777777777778 | 0 |
| 0.8159722222222222 | 0 |
| 0.8166666666666668 | 0 |
| 0.8173611111111111 | 0 |
| 0.8180555555555555 | 0 |
| 0.81875 | 0 |
| 0.8194444444444445 | 0 |
| 0.8201388888888889 | 0 |
| 0.8208333333333333 | 0 |
| 0.8215277777777777 | 0 |
| 0.8222222222222223 | 0 |
| 0.8229166666666666 | 0 |
| 0.8236111111111111 | 0 |
| 0.8243055555555556 | 0 |
| 0.8250000000000001 | 0 |
| 0.8256944444444444 | 0 |
| 0.8263888888888888 | 0 |
| 0.8270833333333334 | 0 |
| 0.8277777777777778 | 0 |
| 0.8284722222222222 | 0 |
| 0.8291666666666666 | 0 |
| 0.8298611111111112 | 0 |
| 0.8305555555555556 | 0 |
| 0.8312499999999999 | 0 |
| 0.8319444444444444 | 0 |
| 0.8326388888888889 | 0 |
| 0.8333333333333334 | 0 |
| 0.8340277777777777 | 0 |
| 0.8347222222222223 | 0 |
| 0.8354166666666667 | 0 |
| 0.8361111111111111 | 0 |
| 0.8368055555555555 | 0 |
| 0.8375 | 0 |
| 0.8381944444444445 | 0 |
| 0.8388888888888889 | 0 |
| 0.8395833333333332 | 0 |
| 0.8402777777777778 | 0 |
| 0.8409722222222222 | 0 |
| 0.8416666666666667 | 0 |
| 0.842361111111111 | 0 |
| 0.8430555555555556 | 0 |
| 0.84375 | 0 |
| 0.8444444444444444 | 0 |
| 0.845138888888889 | 0 |
| 0.8458333333333333 | 0 |
| 0.8465277777777778 | 0 |
| 0.8472222222222222 | 0 |
| 0.8479166666666668 | 0 |
| 0.8486111111111111 | 0 |
| 0.8493055555555555 | 0 |
| 0.85 | 0 |
| 0.8506944444444445 | 0 |
| 0.8513888888888889 | 0 |
| 0.8520833333333333 | 0 |
| 0.8527777777777777 | 0 |
| 0.8534722222222223 | 0 |
| 0.8541666666666666 | 0 |
| 0.8548611111111111 | 0 |
| 0.8555555555555556 | 0 |
| 0.8562500000000001 | 0 |
| 0.8569444444444444 | 0 |
| 0.8576388888888888 | 0 |
| 0.8583333333333334 | 0 |
| 0.8590277777777778 | 0 |
| 0.8597222222222222 | 0 |
| 0.8604166666666666 | 0 |
| 0.8611111111111112 | 0 |
| 0.8618055555555556 | 0 |
| 0.8624999999999999 | 0 |
| 0.8631944444444444 | 0 |
| 0.8638888888888889 | 0 |
| 0.8645833333333334 | 0 |
| 0.8652777777777777 | 0 |
| 0.8659722222222223 | 0 |
| 0.8666666666666667 | 0 |
| 0.8673611111111111 | 0 |
| 0.8680555555555555 | 0 |
| 0.86875 | 0 |
| 0.8694444444444445 | 0 |
| 0.8701388888888889 | 0 |
| 0.8708333333333332 | 0 |
| 0.8715277777777778 | 0 |
| 0.8722222222222222 | 0 |
| 0.8729166666666667 | 0 |
| 0.873611111111111 | 0 |
| 0.8743055555555556 | 0 |
| 0.875 | 0 |
| 0.8756944444444444 | 0 |
| 0.876388888888889 | 0 |
| 0.8770833333333333 | 0 |
| 0.8777777777777778 | 0 |
| 0.8784722222222222 | 0 |
| 0.8791666666666668 | 0 |
| 0.8798611111111111 | 0 |
| 0.8805555555555555 | 0 |
| 0.88125 | 0 |
| 0.8819444444444445 | 0 |
| 0.8826388888888889 | 0 |
| 0.8833333333333333 | 0 |
| 0.8840277777777777 | 0 |
| 0.8847222222222223 | 0 |
| 0.8854166666666666 | 0 |
| 0.8861111111111111 | 0 |
| 0.8868055555555556 | 0 |
| 0.8875000000000001 | 0 |
| 0.8881944444444444 | 0 |
| 0.8888888888888888 | 0 |
| 0.8895833333333334 | 0 |
| 0.8902777777777778 | 0 |
| 0.8909722222222222 | 0 |
| 0.8916666666666666 | 0 |
| 0.8923611111111112 | 0 |
| 0.8930555555555556 | 0 |
| 0.8937499999999999 | 0 |
| 0.8944444444444444 | 0 |
| 0.8951388888888889 | 0 |
| 0.8958333333333334 | 0 |
| 0.8965277777777777 | 0 |
| 0.8972222222222223 | 0 |
| 0.8979166666666667 | 0 |
| 0.8986111111111111 | 0 |
| 0.8993055555555555 | 0 |
| 0.9 | 0 |
| 0.9006944444444445 | 0 |
| 0.9013888888888889 | 0 |
| 0.9020833333333332 | 0 |
| 0.9027777777777778 | 0 |
| 0.9034722222222222 | 0 |
| 0.9041666666666667 | 0 |
| 0.904861111111111 | 0 |
| 0.9055555555555556 | 0 |
| 0.90625 | 0 |
| 0.9069444444444444 | 0 |
| 0.907638888888889 | 0 |
| 0.9083333333333333 | 0 |
| 0.9090277777777778 | 0 |
| 0.9097222222222222 | 0 |
| 0.9104166666666668 | 0 |
| 0.9111111111111111 | 0 |
| 0.9118055555555555 | 0 |
| 0.9125 | 0 |
| 0.9131944444444445 | 0 |
| 0.9138888888888889 | 0 |
| 0.9145833333333333 | 0 |
| 0.9152777777777777 | 0 |
| 0.9159722222222223 | 0 |
| 0.9166666666666666 | 0 |
| 0.9173611111111111 | 0 |
| 0.9180555555555556 | 0 |
| 0.9187500000000001 | 0 |
| 0.9194444444444444 | 0 |
| 0.9201388888888888 | 0 |
| 0.9208333333333334 | 0 |
| 0.9215277777777778 | 0 |
| 0.9222222222222222 | 0 |
| 0.9229166666666666 | 0 |
| 0.9236111111111112 | 0 |
| 0.9243055555555556 | 0 |
| 0.9249999999999999 | 0 |
| 0.9256944444444444 | 0 |
| 0.9263888888888889 | 0 |
| 0.9270833333333334 | 0 |
| 0.9277777777777777 | 0 |
| 0.9284722222222223 | 0 |
| 0.9291666666666667 | 0 |
| 0.9298611111111111 | 0 |
| 0.9305555555555555 | 0 |
| 0.93125 | 0 |
| 0.9319444444444445 | 0 |
| 0.9326388888888889 | 0 |
| 0.9333333333333332 | 0 |
| 0.9340277777777778 | 0 |
| 0.9347222222222222 | 0 |
| 0.9354166666666667 | 0 |
| 0.936111111111111 | 0 |
| 0.9368055555555556 | 0 |
| 0.9375 | 0 |
| 0.9381944444444444 | 0 |
| 0.938888888888889 | 0 |
| 0.9395833333333333 | 0 |
| 0.9402777777777778 | 0 |
| 0.9409722222222222 | 0 |
| 0.9416666666666668 | 0 |
| 0.9423611111111111 | 0 |
| 0.9430555555555555 | 0 |
| 0.94375 | 0 |
| 0.9444444444444445 | 0 |
| 0.9451388888888889 | 0 |
| 0.9458333333333333 | 0 |
| 0.9465277777777777 | 0 |
| 0.9472222222222223 | 0 |
| 0.9479166666666666 | 0 |
| 0.9486111111111111 | 0 |
| 0.9493055555555556 | 0 |
| 0.9500000000000001 | 0 |
| 0.9506944444444444 | 0 |
| 0.9513888888888888 | 0 |
| 0.9520833333333334 | 0 |
| 0.9527777777777778 | 0 |
| 0.9534722222222222 | 0 |
| 0.9541666666666666 | 0 |
| 0.9548611111111112 | 0 |
| 0.9555555555555556 | 0 |
| 0.9562499999999999 | 0 |
| 0.9569444444444444 | 0 |
| 0.9576388888888889 | 0 |
| 0.9583333333333334 | 0 |
| 0.9590277777777777 | 0 |
| 0.9597222222222223 | 0 |
| 0.9604166666666667 | 0 |
| 0.9611111111111111 | 0 |
| 0.9618055555555555 | 0 |
| 0.9625 | 0 |
| 0.9631944444444445 | 0 |
| 0.9638888888888889 | 0 |
| 0.9645833333333332 | 0 |
| 0.9652777777777778 | 0 |
| 0.9659722222222222 | 0 |
| 0.9666666666666667 | 0 |
| 0.967361111111111 | 0 |
| 0.9680555555555556 | 0 |
| 0.96875 | 0 |
| 0.9694444444444444 | 0 |
| 0.970138888888889 | 0 |
| 0.9708333333333333 | 0 |
| 0.9715277777777778 | 0 |
| 0.9722222222222222 | 0 |
| 0.9729166666666668 | 0 |
| 0.9736111111111111 | 0 |
| 0.9743055555555555 | 0 |
| 0.975 | 0 |
| 0.9756944444444445 | 0 |
| 0.9763888888888889 | 0 |
| 0.9770833333333333 | 0 |
| 0.9777777777777777 | 0 |
| 0.9784722222222223 | 0 |
| 0.9791666666666666 | 0 |
| 0.9798611111111111 | 0 |
| 0.9805555555555556 | 0 |
| 0.9812500000000001 | 0 |
| 0.9819444444444444 | 0 |
| 0.9826388888888888 | 0 |
| 0.9833333333333334 | 0 |
| 0.9840277777777778 | 0 |
| 0.9847222222222222 | 0 |
| 0.9854166666666666 | 0 |
| 0.9861111111111112 | 0 |
| 0.9868055555555556 | 0 |
| 0.9874999999999999 | 0 |
| 0.9881944444444444 | 0 |
| 0.9888888888888889 | 0 |
| 0.9895833333333334 | 0 |
| 0.9902777777777777 | 0 |
| 0.9909722222222223 | 0 |
| 0.9916666666666667 | 0 |
| 0.9923611111111111 | 0 |
| 0.9930555555555555 | 0 |
| 0.99375 | 0 |
| 0.9944444444444445 | 0 |
| 0.9951388888888889 | 0 |
| 0.9958333333333332 | 0 |
| 0.9965277777777778 | 0 |
| 0.9972222222222222 | 0 |
| 0.9979166666666667 | 0 |
| 0.998611111111111 | 0 |
| 0.9993055555555556 | 0 |